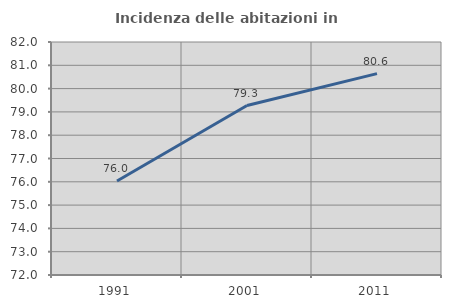
| Category | Incidenza delle abitazioni in proprietà  |
|---|---|
| 1991.0 | 76.032 |
| 2001.0 | 79.274 |
| 2011.0 | 80.642 |